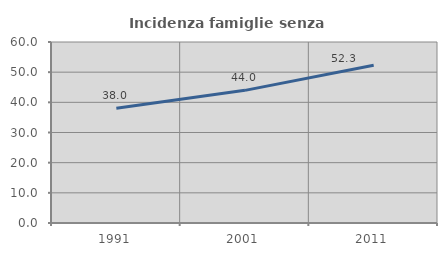
| Category | Incidenza famiglie senza nuclei |
|---|---|
| 1991.0 | 38.028 |
| 2001.0 | 43.97 |
| 2011.0 | 52.261 |